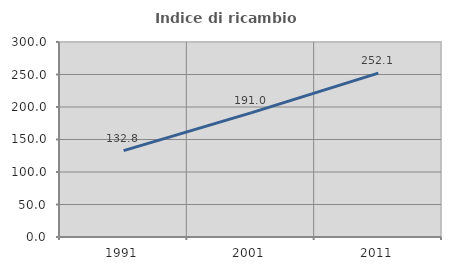
| Category | Indice di ricambio occupazionale  |
|---|---|
| 1991.0 | 132.847 |
| 2001.0 | 190.968 |
| 2011.0 | 252.096 |